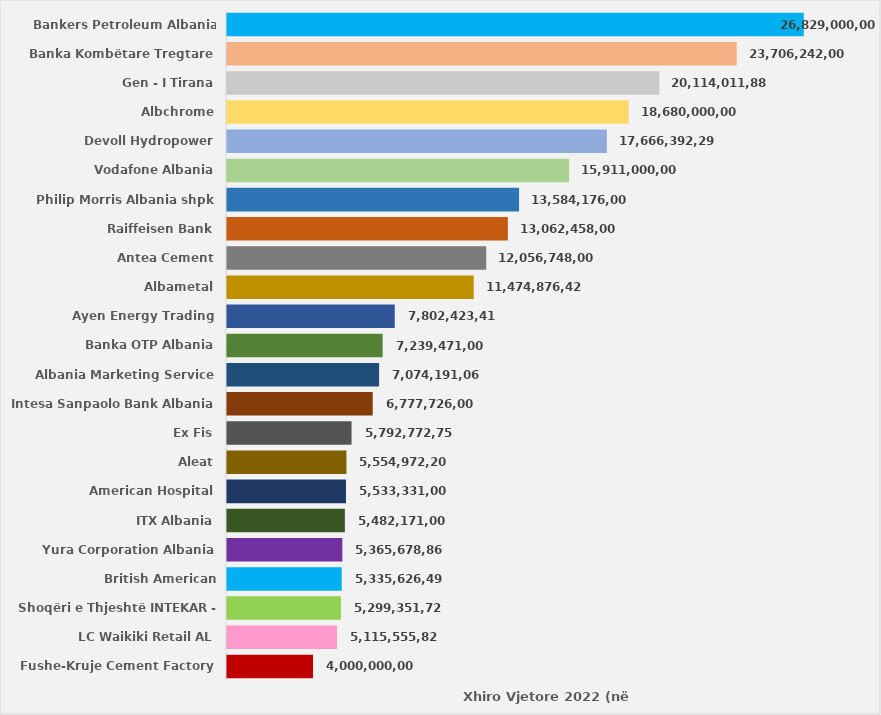
| Category | Series 0 |
|---|---|
| Fushe-Kruje Cement Factory | 4000000000 |
| LC Waikiki Retail AL | 5115555822 |
| Shoqëri e Thjeshtë INTEKAR - ASL | 5299351725 |
| British American Tobacco-Albania | 5335626498 |
| Yura Corporation Albania | 5365678864 |
| ITX Albania | 5482171000 |
| American Hospital | 5533331000 |
| Aleat | 5554972201 |
| Ex Fis | 5792772756 |
| Intesa Sanpaolo Bank Albania | 6777726000 |
| Albania Marketing Service | 7074191064 |
| Banka OTP Albania | 7239471000 |
| Ayen Energy Trading | 7802423415 |
| Albametal | 11474876424 |
| Antea Cement | 12056748000 |
| Raiffeisen Bank | 13062458000 |
| Philip Morris Albania shpk | 13584176000 |
| Vodafone Albania | 15911000000 |
| Devoll Hydropower | 17666392290 |
| Albchrome | 18680000000 |
| Gen - I Tirana | 20114011888 |
| Banka Kombëtare Tregtare | 23706242000 |
| Bankers Petroleum Albania Ltd | 26829000000 |